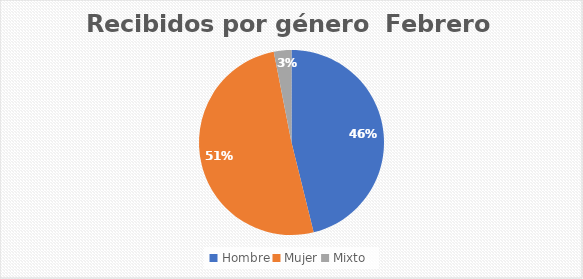
| Category | Recibidos por género  Febrero |
|---|---|
| Hombre | 30 |
| Mujer | 33 |
| Mixto | 2 |